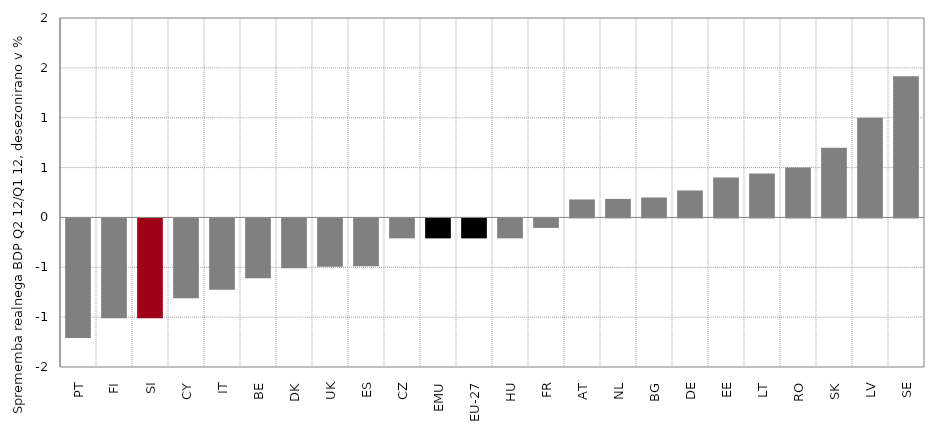
| Category | Series 0 |
|---|---|
| PT | -1.2 |
| FI | -1 |
| SI | -1 |
| CY | -0.8 |
| IT | -0.716 |
| BE | -0.6 |
| DK | -0.499 |
| UK | -0.484 |
| ES | -0.481 |
| CZ | -0.2 |
| EMU | -0.2 |
| EU-27 | -0.2 |
| HU | -0.2 |
| FR | -0.095 |
| AT | 0.18 |
| NL | 0.186 |
| BG | 0.2 |
| DE | 0.27 |
| EE | 0.4 |
| LT | 0.44 |
| RO | 0.5 |
| SK | 0.7 |
| LV | 1 |
| SE | 1.415 |